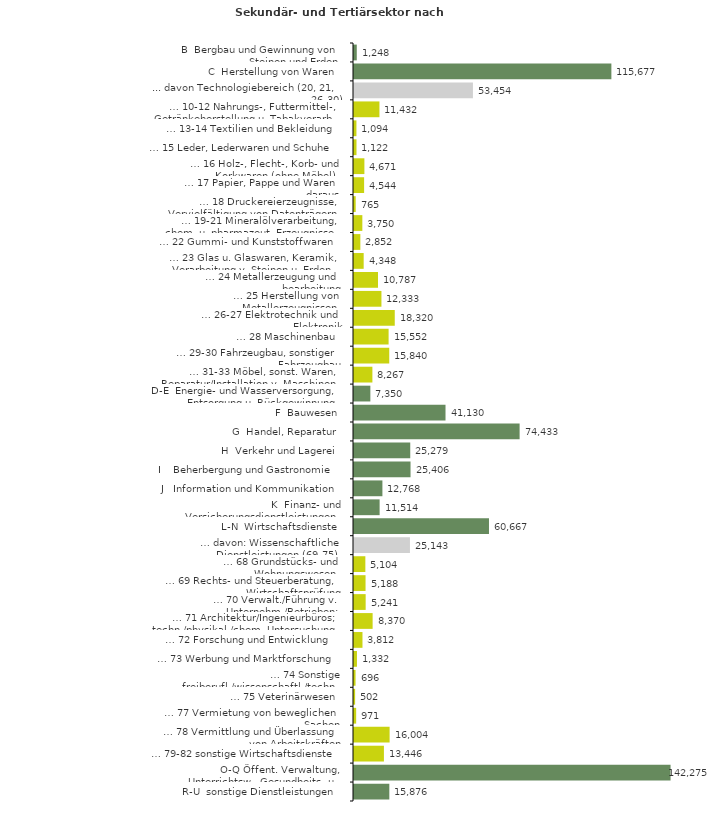
| Category | Series 0 |
|---|---|
| B  Bergbau und Gewinnung von Steinen und Erden | 1248 |
| C  Herstellung von Waren | 115677 |
| ... davon Technologiebereich (20, 21, 26-30) | 53454 |
| … 10-12 Nahrungs-, Futtermittel-, Getränkeherstellung u. Tabakverarb. | 11432 |
| … 13-14 Textilien und Bekleidung | 1094 |
| … 15 Leder, Lederwaren und Schuhe | 1122 |
| … 16 Holz-, Flecht-, Korb- und Korkwaren (ohne Möbel)  | 4671 |
| … 17 Papier, Pappe und Waren daraus  | 4544 |
| … 18 Druckereierzeugnisse, Vervielfältigung von Datenträgern | 765 |
| … 19-21 Mineralölverarbeitung, chem. u. pharmazeut. Erzeugnisse | 3750 |
| … 22 Gummi- und Kunststoffwaren | 2852 |
| … 23 Glas u. Glaswaren, Keramik, Verarbeitung v. Steinen u. Erden  | 4348 |
| … 24 Metallerzeugung und -bearbeitung | 10787 |
| … 25 Herstellung von Metallerzeugnissen  | 12333 |
| … 26-27 Elektrotechnik und Elektronik | 18320 |
| … 28 Maschinenbau | 15552 |
| … 29-30 Fahrzeugbau, sonstiger Fahrzeugbau | 15840 |
| … 31-33 Möbel, sonst. Waren, Reparatur/Installation v. Maschinen | 8267 |
| D-E  Energie- und Wasserversorgung, Entsorgung u. Rückgewinnung | 7350 |
| F  Bauwesen | 41130 |
| G  Handel, Reparatur | 74433 |
| H  Verkehr und Lagerei | 25279 |
| I    Beherbergung und Gastronomie | 25406 |
| J   Information und Kommunikation | 12768 |
| K  Finanz- und Versicherungsdienstleistungen | 11514 |
| L-N  Wirtschaftsdienste | 60667 |
| … davon: Wissenschaftliche Dienstleistungen (69-75) | 25143 |
| … 68 Grundstücks- und Wohnungswesen  | 5104 |
| … 69 Rechts- und Steuerberatung, Wirtschaftsprüfung | 5188 |
| … 70 Verwalt./Führung v. Unternehm./Betrieben; Unternehmensberat. | 5241 |
| … 71 Architektur/Ingenieurbüros; techn./physikal./chem. Untersuchung | 8370 |
| … 72 Forschung und Entwicklung  | 3812 |
| … 73 Werbung und Marktforschung | 1332 |
| … 74 Sonstige freiberufl./wissenschaftl./techn. Tätigkeiten | 696 |
| … 75 Veterinärwesen | 502 |
| … 77 Vermietung von beweglichen Sachen  | 971 |
| … 78 Vermittlung und Überlassung von Arbeitskräften | 16004 |
| … 79-82 sonstige Wirtschaftsdienste | 13446 |
| O-Q Öffent. Verwaltung, Unterrichtsw., Gesundheits- u. Sozialwesen | 142275 |
| R-U  sonstige Dienstleistungen | 15876 |